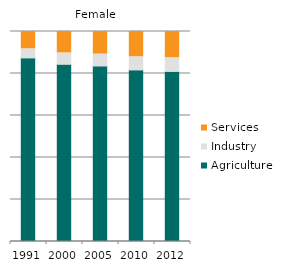
| Category | Agriculture | Industry | Services |
|---|---|---|---|
| 1991.0 | 87.423 | 4.347 | 8.23 |
| 2000.0 | 84.376 | 5.411 | 10.213 |
| 2005.0 | 83.575 | 5.652 | 10.773 |
| 2010.0 | 81.699 | 6.299 | 12.001 |
| 2012.0 | 80.983 | 6.541 | 12.477 |